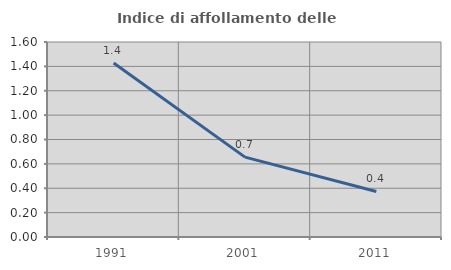
| Category | Indice di affollamento delle abitazioni  |
|---|---|
| 1991.0 | 1.427 |
| 2001.0 | 0.655 |
| 2011.0 | 0.374 |